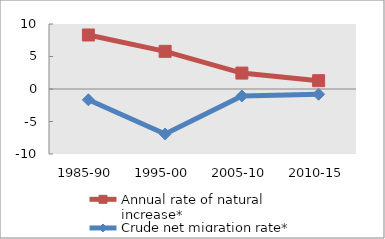
| Category | Annual rate of natural increase* | Crude net migration rate* |
|---|---|---|
| 1985-90 | 8.31 | -1.663 |
| 1995-00 | 5.794 | -6.927 |
| 2005-10 | 2.451 | -1.073 |
| 2010-15 | 1.281 | -0.805 |